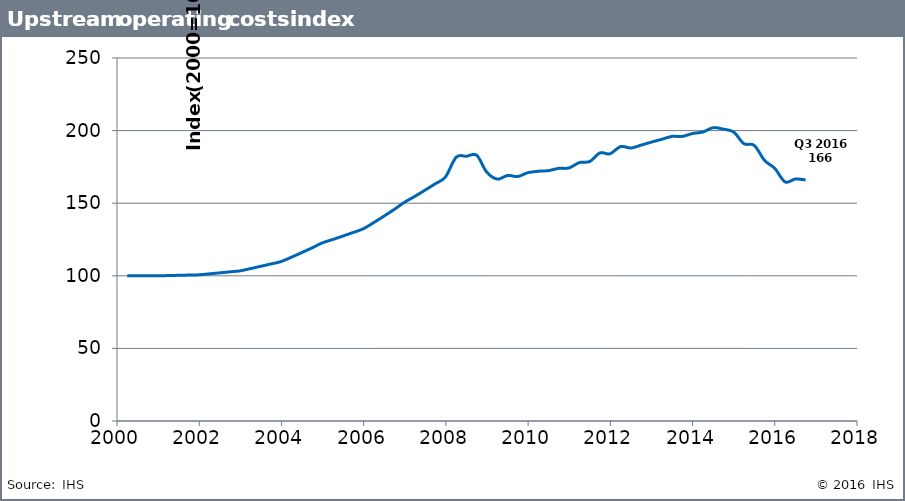
| Category | UOCI |
|---|---|
| 2000.25 | 100 |
| 2000.5 | 100 |
| 2000.75 | 100 |
| 2000.99 | 100 |
| 2001.25 | 100.168 |
| 2001.5 | 100.336 |
| 2001.75 | 100.504 |
| 2001.99 | 100.673 |
| 2002.25 | 101.35 |
| 2002.5 | 102.031 |
| 2002.75 | 102.717 |
| 2002.99 | 103.407 |
| 2003.25 | 104.974 |
| 2003.5 | 106.564 |
| 2003.75 | 108.178 |
| 2003.99 | 109.817 |
| 2004.25 | 112.892 |
| 2004.5 | 116.054 |
| 2004.75 | 119.304 |
| 2004.99 | 122.645 |
| 2005.25 | 125.012 |
| 2005.5 | 127.424 |
| 2005.75 | 129.883 |
| 2005.99 | 132.389 |
| 2006.25 | 136.725 |
| 2006.5 | 141.203 |
| 2006.75 | 145.827 |
| 2006.99 | 150.604 |
| 2007.25 | 154.794 |
| 2007.5 | 159.102 |
| 2007.75 | 163.529 |
| 2007.99 | 168.079 |
| 2008.25 | 181.682 |
| 2008.5 | 182.338 |
| 2008.75 | 182.995 |
| 2008.99 | 171.562 |
| 2009.25 | 166.606 |
| 2009.5 | 169.095 |
| 2009.75 | 168.387 |
| 2009.99 | 171 |
| 2010.25 | 172 |
| 2010.5 | 172.459 |
| 2010.75 | 174.027 |
| 2010.99 | 174.224 |
| 2011.25 | 178 |
| 2011.5 | 178.745 |
| 2011.75 | 184.666 |
| 2011.99 | 184 |
| 2012.25 | 189 |
| 2012.5 | 188 |
| 2012.75 | 190 |
| 2012.99 | 192 |
| 2013.25 | 194 |
| 2013.5 | 196 |
| 2013.75 | 196 |
| 2014.0 | 198 |
| 2014.25 | 199 |
| 2014.5 | 202 |
| 2014.75 | 201 |
| 2015.0 | 199 |
| 2015.25 | 191 |
| 2015.5 | 189.831 |
| 2015.75 | 179.516 |
| 2016.0 | 173.97 |
| 2016.25 | 164.662 |
| 2016.5 | 166.644 |
| 2016.75 | 166.024 |